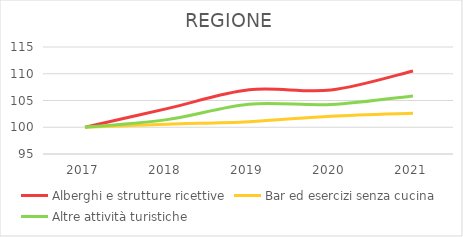
| Category | Alberghi e strutture ricettive | Bar ed esercizi senza cucina | Altre attività turistiche |
|---|---|---|---|
| 2017.0 | 100 | 100 | 100 |
| 2018.0 | 103.484 | 100.566 | 101.423 |
| 2019.0 | 107 | 101.044 | 104.305 |
| 2020.0 | 106.969 | 102.078 | 104.243 |
| 2021.0 | 110.516 | 102.637 | 105.852 |